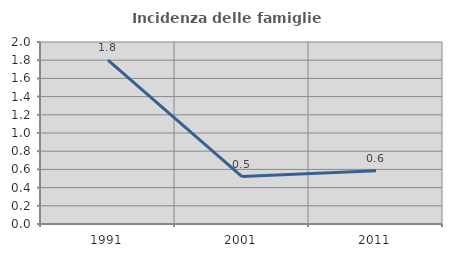
| Category | Incidenza delle famiglie numerose |
|---|---|
| 1991.0 | 1.8 |
| 2001.0 | 0.522 |
| 2011.0 | 0.585 |